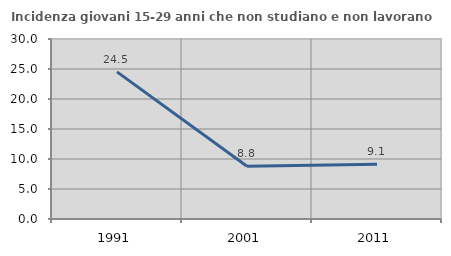
| Category | Incidenza giovani 15-29 anni che non studiano e non lavorano  |
|---|---|
| 1991.0 | 24.516 |
| 2001.0 | 8.793 |
| 2011.0 | 9.145 |